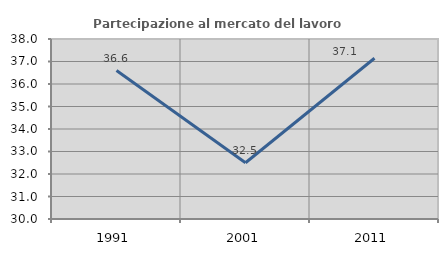
| Category | Partecipazione al mercato del lavoro  femminile |
|---|---|
| 1991.0 | 36.597 |
| 2001.0 | 32.5 |
| 2011.0 | 37.146 |